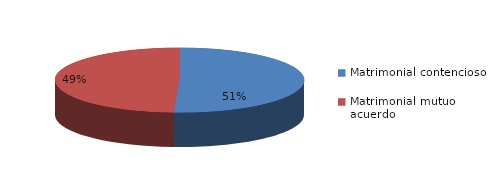
| Category | Series 0 |
|---|---|
| 0 | 734 |
| 1 | 714 |